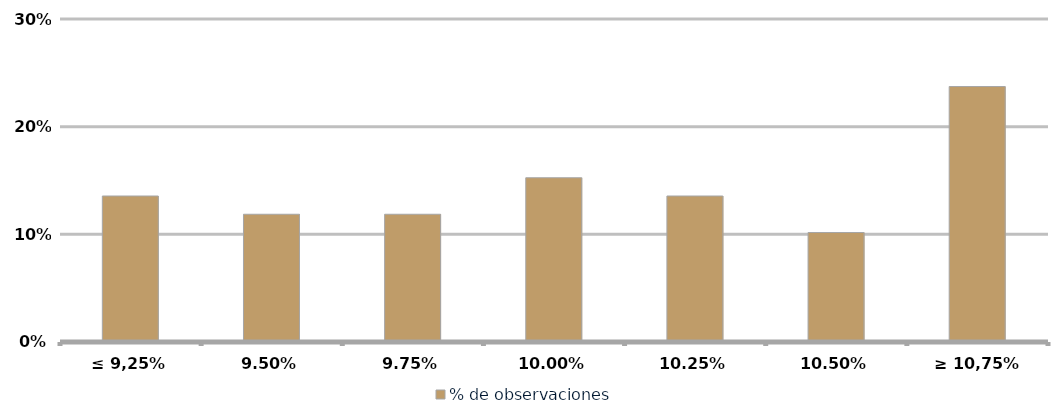
| Category | % de observaciones  |
|---|---|
| ≤ 9,25% | 0.136 |
| 9,50% | 0.119 |
| 9,75% | 0.119 |
| 10,00% | 0.153 |
| 10,25% | 0.136 |
| 10,50% | 0.102 |
| ≥ 10,75% | 0.237 |